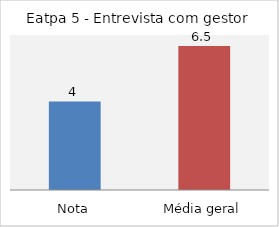
| Category | Eatpa 5 - Entrevista com gestor |
|---|---|
| Nota | 4 |
| Média geral | 6.5 |